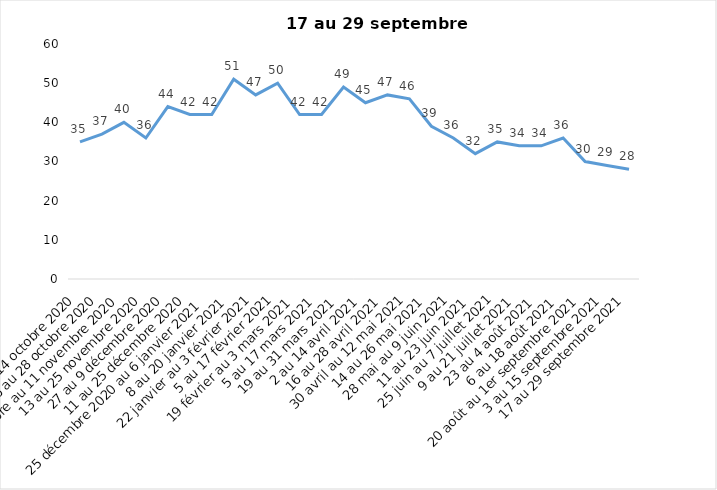
| Category | Toujours aux trois mesures |
|---|---|
| 2 au 14 octobre 2020 | 35 |
| 16 au 28 octobre 2020 | 37 |
| 30 octobre au 11 novembre 2020 | 40 |
| 13 au 25 novembre 2020 | 36 |
| 27 au 9 décembre 2020 | 44 |
| 11 au 25 décembre 2020 | 42 |
| 25 décembre 2020 au 6 janvier 2021 | 42 |
| 8 au 20 janvier 2021 | 51 |
| 22 janvier au 3 février 2021 | 47 |
| 5 au 17 février 2021 | 50 |
| 19 février au 3 mars 2021 | 42 |
| 5 au 17 mars 2021 | 42 |
| 19 au 31 mars 2021 | 49 |
| 2 au 14 avril 2021 | 45 |
| 16 au 28 avril 2021 | 47 |
| 30 avril au 12 mai 2021 | 46 |
| 14 au 26 mai 2021 | 39 |
| 28 mai au 9 juin 2021 | 36 |
| 11 au 23 juin 2021 | 32 |
| 25 juin au 7 juillet 2021 | 35 |
| 9 au 21 juillet 2021 | 34 |
| 23 au 4 août 2021 | 34 |
| 6 au 18 août 2021 | 36 |
| 20 août au 1er septembre 2021 | 30 |
| 3 au 15 septembre 2021 | 29 |
| 17 au 29 septembre 2021 | 28 |